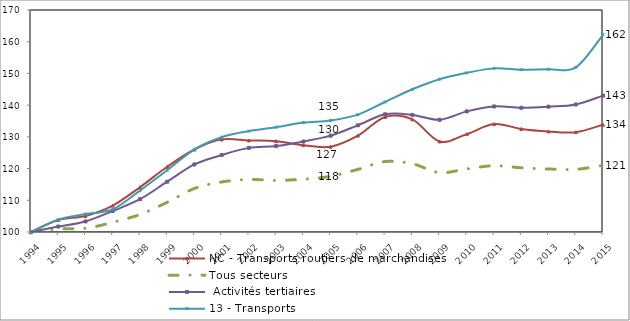
| Category | NC - Transports routiers de marchandises | Tous secteurs |  Activités tertiaires | 13 - Transports | ligne 100 |
|---|---|---|---|---|---|
| 1994.0 | 100 | 100 | 100 | 100 | 100 |
| 1995.0 | 103.776 | 100.976 | 101.715 | 103.898 | 100 |
| 1996.0 | 105.068 | 101.173 | 103.336 | 105.655 | 100 |
| 1997.0 | 108.326 | 103.051 | 106.612 | 107.166 | 100 |
| 1998.0 | 114.113 | 105.521 | 110.333 | 113.066 | 100 |
| 1999.0 | 120.576 | 109.358 | 115.859 | 119.475 | 100 |
| 2000.0 | 126.008 | 113.726 | 121.31 | 126.073 | 100 |
| 2001.0 | 129.205 | 115.771 | 124.267 | 129.89 | 100 |
| 2002.0 | 128.867 | 116.569 | 126.525 | 131.809 | 100 |
| 2003.0 | 128.646 | 116.267 | 127.094 | 133.048 | 100 |
| 2004.0 | 127.364 | 116.656 | 128.528 | 134.502 | 100 |
| 2005.0 | 126.899 | 117.561 | 130.376 | 135.174 | 100 |
| 2006.0 | 130.389 | 119.737 | 133.632 | 137 | 100 |
| 2007.0 | 136.279 | 122.208 | 137.117 | 141 | 100 |
| 2008.0 | 135.516 | 121.534 | 136.926 | 145 | 100 |
| 2009.0 | 128.551 | 118.728 | 135.391 | 148.188 | 100 |
| 2010.0 | 130.867 | 119.898 | 138.039 | 150.175 | 100 |
| 2011.0 | 134.021 | 120.906 | 139.588 | 151.594 | 100 |
| 2012.0 | 132.494 | 120.241 | 139.17 | 151.182 | 100 |
| 2013.0 | 131.72 | 119.868 | 139.508 | 151.317 | 100 |
| 2014.0 | 131.481 | 119.744 | 140.209 | 151.928 | 100 |
| 2015.0 | 133.824 | 121.011 | 143.008 | 162.183 | 100 |